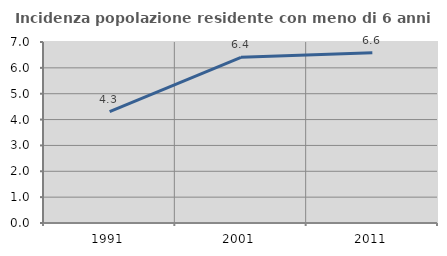
| Category | Incidenza popolazione residente con meno di 6 anni |
|---|---|
| 1991.0 | 4.307 |
| 2001.0 | 6.407 |
| 2011.0 | 6.581 |